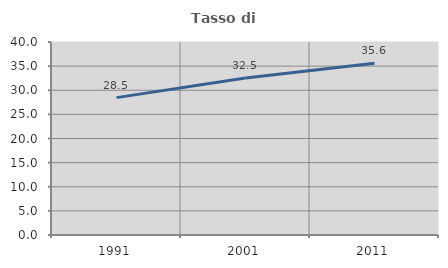
| Category | Tasso di occupazione   |
|---|---|
| 1991.0 | 28.468 |
| 2001.0 | 32.518 |
| 2011.0 | 35.585 |